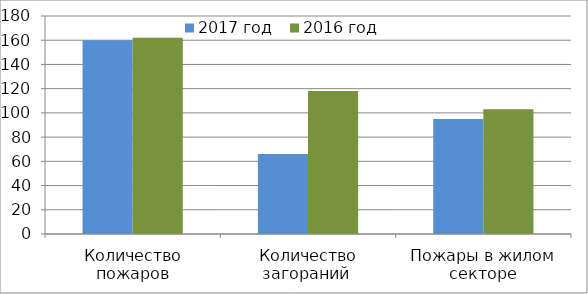
| Category | 2017 год | 2016 год |
|---|---|---|
| Количество пожаров | 160 | 162 |
| Количество загораний  | 66 | 118 |
| Пожары в жилом секторе | 95 | 103 |